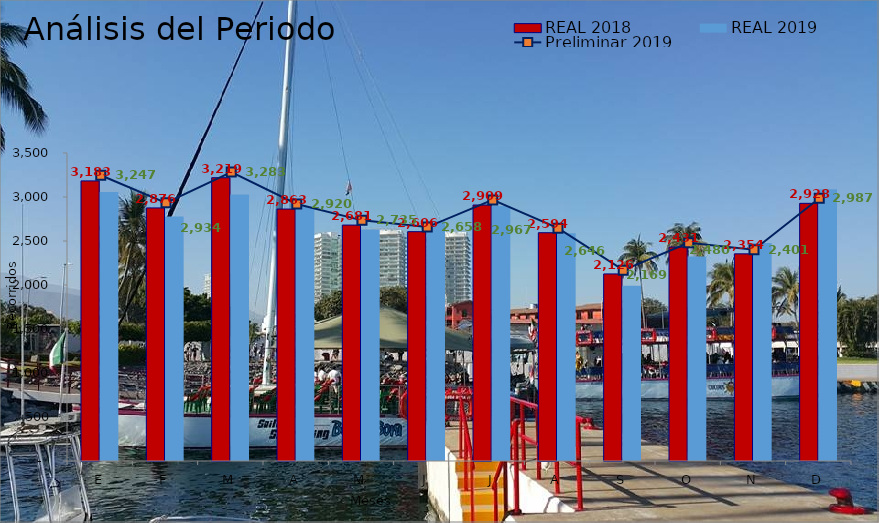
| Category | REAL 2018 | REAL 2019 |
|---|---|---|
| E | 3183 | 3056 |
| F | 2876 | 2779 |
| M | 3219 | 3027 |
| A | 2863 | 2886 |
| M | 2681 | 2632 |
| J | 2606 | 2729 |
| J | 2909 | 2899 |
| A | 2594 | 2587 |
| S | 2126 | 1992 |
| O | 2431 | 2323 |
| N | 2354 | 2477 |
| D | 2928 | 3089 |